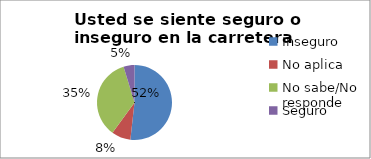
| Category | Series 0 |
|---|---|
| Inseguro | 0.518 |
| No aplica | 0.082 |
| No sabe/No responde | 0.353 |
| Seguro | 0.047 |